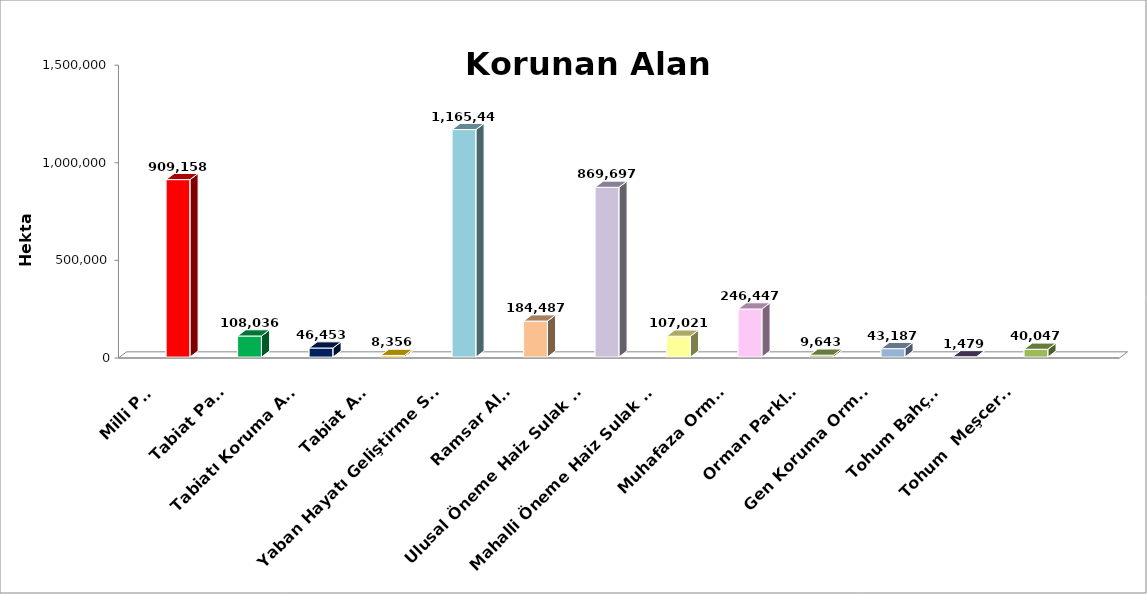
| Category | Series 0 | Series 1 | Series 2 |
|---|---|---|---|
| Milli Park |  |  | 909158 |
| Tabiat Parkı |  |  | 108036 |
| Tabiatı Koruma Alanı |  |  | 46453 |
| Tabiat Anıtı |  |  | 8356 |
| Yaban Hayatı Geliştirme Sahası |  |  | 1165448 |
| Ramsar Alanı |  |  | 184487 |
| Ulusal Öneme Haiz Sulak Alan |  |  | 869697 |
| Mahalli Öneme Haiz Sulak Alan |  |  | 107021 |
| Muhafaza Ormanı |  |  | 246447 |
| Orman Parkları |  |  | 9643 |
| Gen Koruma Ormanı |  |  | 43187 |
| Tohum Bahçesi |  |  | 1479 |
| Tohum  Meşceresi |  |  | 40047 |